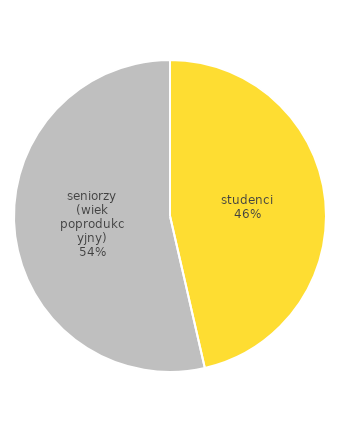
| Category | Series 0 |
|---|---|
| studenci | 112 |
| seniorzy (wiek poprodukcyjny) | 129.3 |